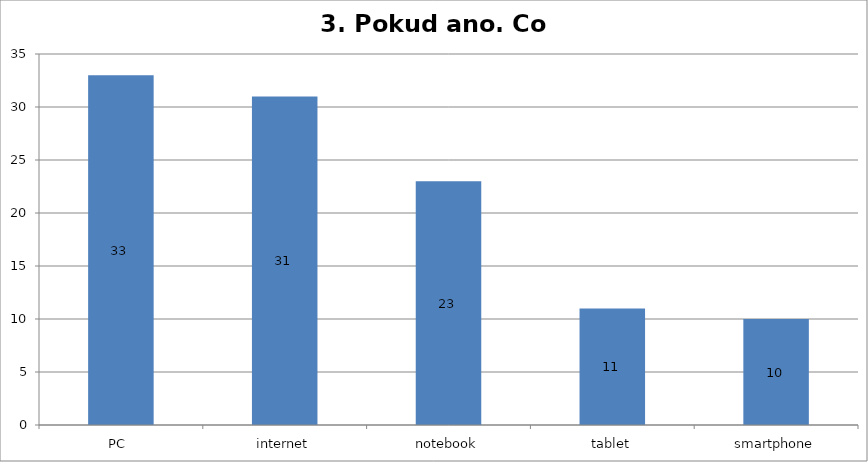
| Category | Series 0 |
|---|---|
| PC  | 33 |
| internet | 31 |
| notebook | 23 |
| tablet | 11 |
| smartphone | 10 |